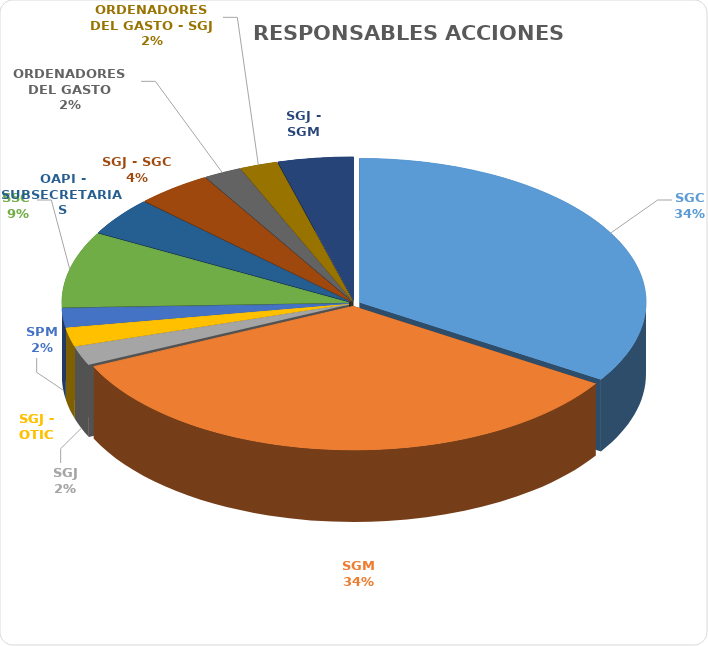
| Category | Series 0 |
|---|---|
| SGC | 16 |
| SGM | 16 |
| SGJ | 1 |
| SGJ - OTIC | 1 |
| SPM | 1 |
| SSC  | 4 |
| OAPI - SUBSECRETARIAS | 2 |
| SGJ - SGC | 2 |
| ORDENADORES DEL GASTO | 1 |
| ORDENADORES DEL GASTO - SGJ | 1 |
| SGJ - SGM | 2 |